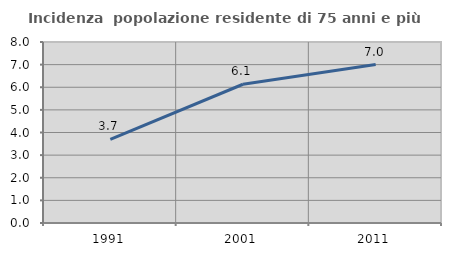
| Category | Incidenza  popolazione residente di 75 anni e più |
|---|---|
| 1991.0 | 3.7 |
| 2001.0 | 6.132 |
| 2011.0 | 7.001 |